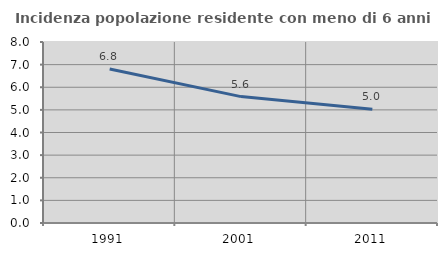
| Category | Incidenza popolazione residente con meno di 6 anni |
|---|---|
| 1991.0 | 6.806 |
| 2001.0 | 5.587 |
| 2011.0 | 5.026 |